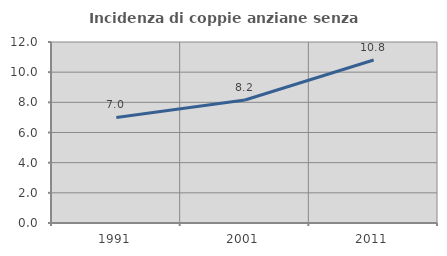
| Category | Incidenza di coppie anziane senza figli  |
|---|---|
| 1991.0 | 6.998 |
| 2001.0 | 8.155 |
| 2011.0 | 10.803 |